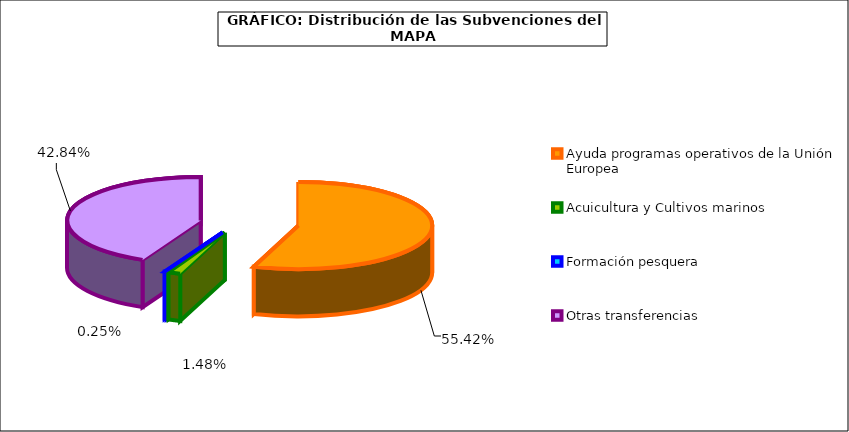
| Category | Series 0 |
|---|---|
| Ayuda programas operativos de la Unión Europea  | 11949.299 |
| Acuicultura y Cultivos marinos | 320 |
| Formación pesquera | 54.613 |
| Otras transferencias | 9236.68 |